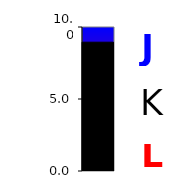
| Category | Series 0 |
|---|---|
| 0 | 8.945 |